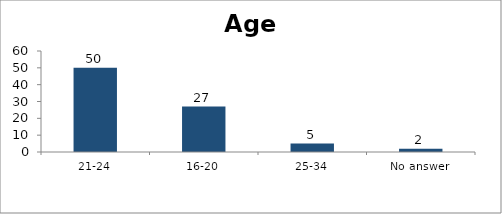
| Category | Age |
|---|---|
| 21-24 | 50 |
| 16-20 | 27 |
| 25-34 | 5 |
| No answer | 2 |